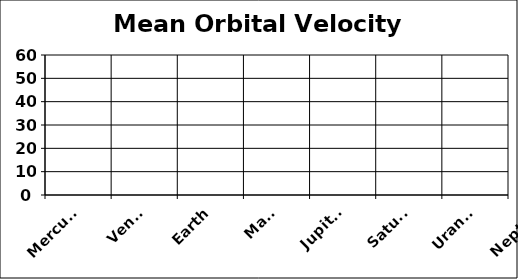
| Category | Mean Orbital Velocity (km/Sec) |
|---|---|
| Mercury | 47.89 |
| Venus | 35.03 |
| Earth | 29.79 |
| Mars | 24.13 |
| Jupiter | 13.06 |
| Saturn | 9.64 |
| Uranus | 6.81 |
| Neptune | 5.43 |